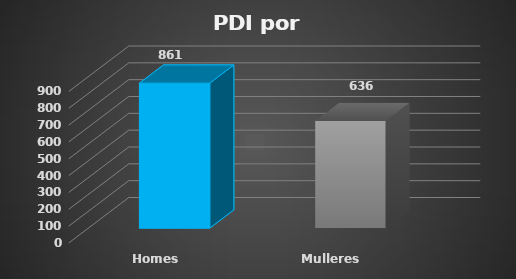
| Category | Series 2 |
|---|---|
| Homes | 861 |
| Mulleres | 636 |